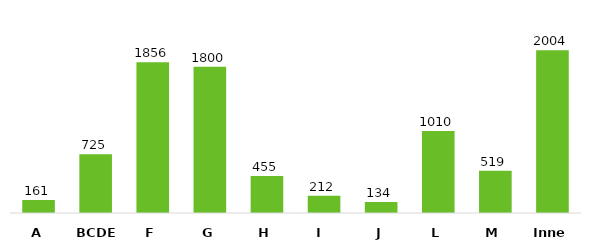
| Category | Series 0 |
|---|---|
| A | 161 |
| BCDE | 725 |
| F | 1856 |
| G | 1800 |
| H | 455 |
| I  | 212 |
| J | 134 |
| L | 1010 |
| M | 519 |
| Inne | 2004 |